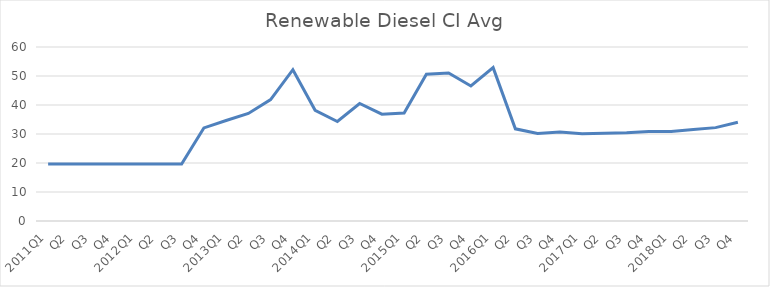
| Category | Series 0 |
|---|---|
| 2011Q1 | 19.65 |
| Q2 | 19.65 |
| Q3 | 19.65 |
| Q4 | 19.65 |
| 2012Q1 | 19.65 |
| Q2 | 19.65 |
| Q3 | 19.65 |
| Q4 | 32.11 |
| 2013Q1 | 34.65 |
| Q2 | 37.1 |
| Q3 | 41.86 |
| Q4 | 52.18 |
| 2014Q1 | 38.16 |
| Q2 | 34.32 |
| Q3 | 40.53 |
| Q4 | 36.84 |
| 2015Q1 | 37.26 |
| Q2 | 50.63 |
| Q3 | 51.06 |
| Q4 | 46.56 |
| 2016Q1 | 52.89 |
| Q2 | 31.78 |
| Q3 | 30.2 |
| Q4 | 30.71 |
| 2017Q1 | 30.11 |
| Q2 | 30.23 |
| Q3 | 30.39 |
| Q4 | 30.9 |
| 2018Q1 | 30.9 |
| Q2 | 31.53 |
| Q3 | 32.2 |
| Q4 | 34.05 |